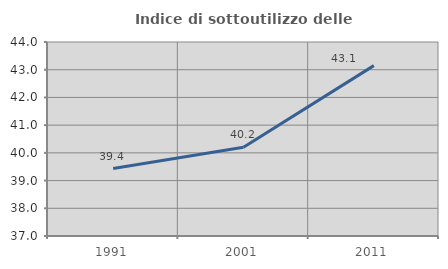
| Category | Indice di sottoutilizzo delle abitazioni  |
|---|---|
| 1991.0 | 39.435 |
| 2001.0 | 40.2 |
| 2011.0 | 43.147 |